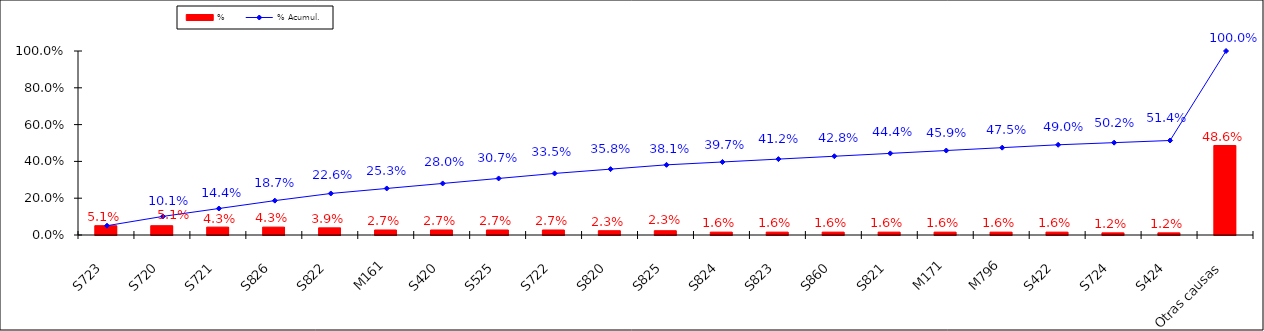
| Category | % |
|---|---|
| S723 | 0.051 |
| S720 | 0.051 |
| S721 | 0.043 |
| S826 | 0.043 |
| S822 | 0.039 |
| M161 | 0.027 |
| S420 | 0.027 |
| S525 | 0.027 |
| S722 | 0.027 |
| S820 | 0.023 |
| S825 | 0.023 |
| S824 | 0.016 |
| S823 | 0.016 |
| S860 | 0.016 |
| S821 | 0.016 |
| M171 | 0.016 |
| M796 | 0.016 |
| S422 | 0.016 |
| S724 | 0.012 |
| S424 | 0.012 |
| Otras causas | 0.486 |